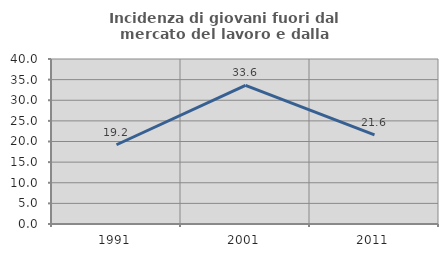
| Category | Incidenza di giovani fuori dal mercato del lavoro e dalla formazione  |
|---|---|
| 1991.0 | 19.213 |
| 2001.0 | 33.621 |
| 2011.0 | 21.599 |